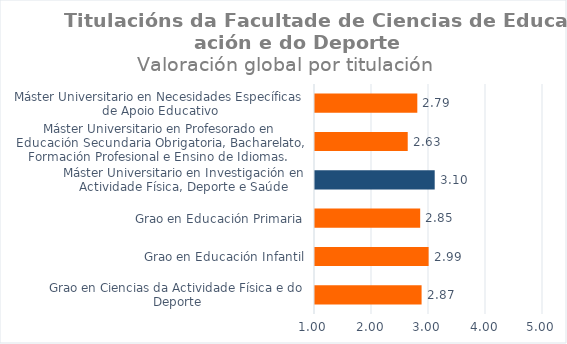
| Category | Series 0 |
|---|---|
| Grao en Ciencias da Actividade Física e do Deporte | 2.87 |
| Grao en Educación Infantil | 2.993 |
| Grao en Educación Primaria | 2.845 |
| Máster Universitario en Investigación en Actividade Física, Deporte e Saúde | 3.1 |
| Máster Universitario en Profesorado en Educación Secundaria Obrigatoria, Bacharelato, Formación Profesional e Ensino de Idiomas.  | 2.627 |
| Máster Universitario en Necesidades Específicas de Apoio Educativo | 2.795 |